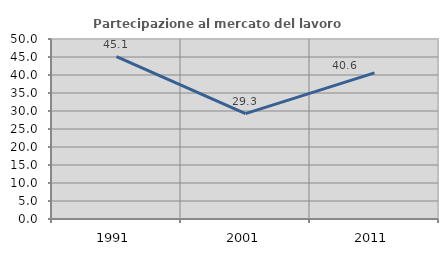
| Category | Partecipazione al mercato del lavoro  femminile |
|---|---|
| 1991.0 | 45.092 |
| 2001.0 | 29.272 |
| 2011.0 | 40.583 |